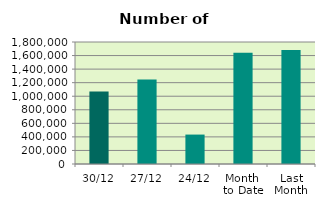
| Category | Series 0 |
|---|---|
| 30/12 | 1070288 |
| 27/12 | 1247356 |
| 24/12 | 434190 |
| Month 
to Date | 1641294 |
| Last
Month | 1681386.857 |